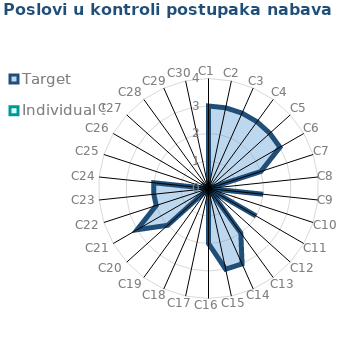
| Category | Target | Individual 5 |
|---|---|---|
| C1 | 3 | 0 |
| C2 | 3 | 0 |
| C3 | 3 | 0 |
| C4 | 3 | 0 |
| C5 | 3 | 0 |
| C6 | 3 | 0 |
| C7 | 2 | 0 |
| C8 | 0 | 0 |
| C9 | 2 | 0 |
| C10 | 0 | 0 |
| C11 | 2 | 0 |
| C12 | 0 | 0 |
| C13 | 2 | 0 |
| C14 | 3 | 0 |
| C15 | 3 | 0 |
| C16 | 2 | 0 |
| C17 | 0 | 0 |
| C18 | 0 | 0 |
| C19 | 0 | 0 |
| C20 | 2 | 0 |
| C21 | 3 | 0 |
| C22 | 2 | 0 |
| C23 | 2 | 0 |
| C24 | 2 | 0 |
| C25 | 0 | 0 |
| C26 | 0 | 0 |
| C27 | 0 | 0 |
| C28 | 0 | 0 |
| C29 | 0 | 0 |
| C30 | 0 | 0 |